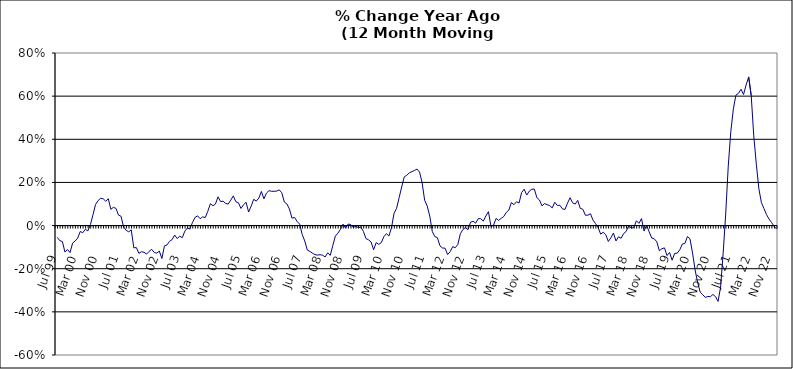
| Category | Series 0 |
|---|---|
| Jul 99 | -0.055 |
| Aug 99 | -0.07 |
| Sep 99 | -0.074 |
| Oct 99 | -0.123 |
| Nov 99 | -0.111 |
| Dec 99 | -0.125 |
| Jan 00 | -0.082 |
| Feb 00 | -0.071 |
| Mar 00 | -0.058 |
| Apr 00 | -0.027 |
| May 00 | -0.033 |
| Jun 00 | -0.017 |
| Jul 00 | -0.025 |
| Aug 00 | 0.005 |
| Sep 00 | 0.05 |
| Oct 00 | 0.098 |
| Nov 00 | 0.116 |
| Dec 00 | 0.127 |
| Jan 01 | 0.124 |
| Feb 01 | 0.113 |
| Mar 01 | 0.124 |
| Apr 01 | 0.075 |
| May 01 | 0.085 |
| Jun 01 | 0.08 |
| Jul 01 | 0.048 |
| Aug 01 | 0.043 |
| Sep 01 | -0.007 |
| Oct 01 | -0.022 |
| Nov 01 | -0.029 |
| Dec 01 | -0.02 |
| Jan 02 | -0.103 |
| Feb 02 | -0.102 |
| Mar 02 | -0.129 |
| Apr 02 | -0.121 |
| May 02 | -0.124 |
| Jun 02 | -0.132 |
| Jul 02 | -0.119 |
| Aug 02 | -0.11 |
| Sep 02 | -0.125 |
| Oct 02 | -0.128 |
| Nov 02 | -0.118 |
| Dec 02 | -0.153 |
| Jan 03 | -0.094 |
| Feb 03 | -0.09 |
| Mar 03 | -0.073 |
| Apr 03 | -0.065 |
| May 03 | -0.044 |
| Jun 03 | -0.06 |
| Jul 03 | -0.049 |
| Aug 03 | -0.056 |
| Sep 03 | -0.026 |
| Oct 03 | -0.012 |
| Nov 03 | -0.016 |
| Dec 03 | 0.014 |
| Jan 04 | 0.038 |
| Feb 04 | 0.045 |
| Mar 04 | 0.032 |
| Apr 04 | 0.041 |
| May 04 | 0.037 |
| Jun 04 | 0.066 |
| Jul 04 | 0.101 |
| Aug 04 | 0.092 |
| Sep 04 | 0.1 |
| Oct 04 | 0.133 |
| Nov 04 | 0.111 |
| Dec 04 | 0.113 |
| Jan 05 | 0.103 |
| Feb 05 | 0.1 |
| Mar 05 | 0.118 |
| Apr 05 | 0.138 |
| May 05 | 0.11 |
| Jun 05 | 0.106 |
| Jul 05 | 0.079 |
| Aug 05 | 0.097 |
| Sep 05 | 0.108 |
| Oct 05 | 0.063 |
| Nov 05 | 0.09 |
| Dec 05 | 0.122 |
| Jan 06 | 0.114 |
| Feb 06 | 0.127 |
| Mar 06 | 0.158 |
| Apr 06 | 0.124 |
| May 06 | 0.151 |
| Jun 06 | 0.162 |
| Jul 06 | 0.159 |
| Aug 06 | 0.159 |
| Sep 06 | 0.16 |
| Oct 06 | 0.166 |
| Nov 06 | 0.152 |
| Dec 06 | 0.109 |
| Jan 07 | 0.101 |
| Feb 07 | 0.076 |
| Mar 07 | 0.034 |
| Apr 07 | 0.038 |
| May 07 | 0.019 |
| Jun 07 | 0.007 |
| Jul 07 | -0.041 |
| Aug 07 | -0.071 |
| Sep 07 | -0.113 |
| Oct 07 | -0.12 |
| Nov 07 | -0.128 |
| Dec 07 | -0.135 |
| Jan 08 | -0.137 |
| Feb 08 | -0.135 |
| Mar 08 | -0.137 |
| Apr 08 | -0.145 |
| May 08 | -0.126 |
| Jun 08 | -0.138 |
| Jul 08 | -0.093 |
| Aug 08 | -0.049 |
| Sep-08 | -0.035 |
| Oct 08 | -0.018 |
| Nov 08 | 0.007 |
| Dec 08 | -0.011 |
| Jan 09 | 0.007 |
| Feb 09 | 0.005 |
| Mar 09 | -0.009 |
| Apr 09 | -0.003 |
| May 09 | -0.01 |
| Jun 09 | -0.007 |
| Jul 09 | -0.027 |
| Aug 09 | -0.06 |
| Sep 09 | -0.066 |
| Oct 09 | -0.076 |
| Nov 09 | -0.112 |
| Dec 09 | -0.079 |
| Jan 10 | -0.087 |
| Feb 10 | -0.079 |
| Mar 10 | -0.052 |
| Apr 10 | -0.037 |
| May 10 | -0.048 |
| Jun 10 | -0.01 |
| Jul 10 | 0.057 |
| Aug 10 | 0.08 |
| Sep 10 | 0.13 |
| Oct 10 | 0.179 |
| Nov 10 | 0.226 |
| Dec 10 | 0.233 |
| Jan 11 | 0.245 |
| Feb 11 | 0.25 |
| Mar 11 | 0.255 |
| Apr 11 | 0.262 |
| May 11 | 0.248 |
| Jun 11 | 0.199 |
| Jul 11 | 0.118 |
| Aug 11 | 0.09 |
| Sep 11 | 0.044 |
| Oct 11 | -0.028 |
| Nov 11 | -0.051 |
| Dec 11 | -0.056 |
| Jan 12 | -0.094 |
| Feb 12 | -0.104 |
| Mar 12 | -0.105 |
| Apr 12 | -0.134 |
| May 12 | -0.121 |
| Jun 12 | -0.098 |
| Jul 12 | -0.103 |
| Aug 12 | -0.087 |
| Sep 12 | -0.038 |
| Oct 12 | -0.018 |
| Nov 12 | -0.009 |
| Dec 12 | -0.019 |
| Jan 13 | 0.016 |
| Feb-13 | 0.02 |
| Mar-13 | 0.011 |
| Apr 13 | 0.032 |
| May 13 | 0.032 |
| Jun-13 | 0.021 |
| Jul 13 | 0.045 |
| Aug 13 | 0.065 |
| Sep 13 | -0.005 |
| Oct 13 | 0.002 |
| Nov 13 | 0.033 |
| Dec 13 | 0.024 |
| Jan 14 | 0.034 |
| Feb-14 | 0.042 |
| Mar 14 | 0.061 |
| Apr 14 | 0.072 |
| May 14 | 0.107 |
| Jun 14 | 0.097 |
| Jul-14 | 0.111 |
| Aug-14 | 0.105 |
| Sep 14 | 0.153 |
| Oct 14 | 0.169 |
| Nov 14 | 0.141 |
| Dec 14 | 0.159 |
| Jan 15 | 0.169 |
| Feb 15 | 0.169 |
| Mar 15 | 0.129 |
| Apr-15 | 0.118 |
| May 15 | 0.091 |
| Jun-15 | 0.102 |
| Jul 15 | 0.097 |
| Aug 15 | 0.092 |
| Sep 15 | 0.082 |
| Oct 15 | 0.108 |
| Nov 15 | 0.093 |
| Dec 15 | 0.094 |
| Jan 16 | 0.078 |
| Feb 16 | 0.075 |
| Mar 16 | 0.104 |
| Apr 16 | 0.129 |
| May 16 | 0.105 |
| Jun 16 | 0.1 |
| Jul 16 | 0.117 |
| Aug 16 | 0.08 |
| Sep 16 | 0.076 |
| Oct 16 | 0.048 |
| Nov 16 | 0.048 |
| Dec 16 | 0.055 |
| Jan 17 | 0.025 |
| Feb 17 | 0.009 |
| Mar 17 | -0.01 |
| Apr 17 | -0.04 |
| May 17 | -0.031 |
| Jun 17 | -0.042 |
| Jul 17 | -0.074 |
| Aug 17 | -0.057 |
| Sep 17 | -0.035 |
| Oct 17 | -0.071 |
| Nov 17 | -0.052 |
| Dec 17 | -0.059 |
| Jan 18 | -0.037 |
| Feb 18 | -0.027 |
| Mar 18 | 0 |
| Apr 18 | -0.012 |
| May 18 | -0.009 |
| Jun 18 | 0.022 |
| Jul 18 | 0.01 |
| Aug 18 | 0.033 |
| Sep 18 | -0.025 |
| Oct 18 | 0.002 |
| Nov 18 | -0.029 |
| Dec 18 | -0.058 |
| Jan 19 | -0.061 |
| Feb 19 | -0.075 |
| Mar 19 | -0.117 |
| Apr 19 | -0.107 |
| May 19 | -0.104 |
| Jun 19 | -0.139 |
| Jul 19 | -0.124 |
| Aug 19 | -0.16 |
| Sep 19 | -0.129 |
| Oct 19 | -0.128 |
| Nov 19 | -0.112 |
| Dec 19 | -0.085 |
| Jan 20 | -0.083 |
| Feb 20 | -0.051 |
| Mar 20 | -0.061 |
| Apr 20 | -0.127 |
| May 20 | -0.206 |
| Jun 20 | -0.264 |
| Jul 20 | -0.308 |
| Aug 20 | -0.32 |
| Sep 20 | -0.333 |
| Oct 20 | -0.329 |
| Nov 20 | -0.33 |
| Dec 20 | -0.319 |
| Jan 21 | -0.329 |
| Feb 21 | -0.352 |
| Mar 21 | -0.286 |
| Apr 21 | -0.129 |
| May 21 | 0.053 |
| Jun 21 | 0.276 |
| Jul 21 | 0.435 |
| Aug 21 | 0.541 |
| Sep 21 | 0.604 |
| Oct 21 | 0.613 |
| Nov 21 | 0.632 |
| Dec 21 | 0.608 |
| Jan 22 | 0.652 |
| Feb 22 | 0.689 |
| Mar 22 | 0.603 |
| Apr 22 | 0.416 |
| May 22 | 0.285 |
| Jun 22 | 0.171 |
| Jul 22 | 0.106 |
| Aug 22 | 0.079 |
| Sep 22 | 0.051 |
| Oct 22 | 0.03 |
| Nov 22 | 0.014 |
| Dec 22 | -0.004 |
| Jan 23 | -0.017 |